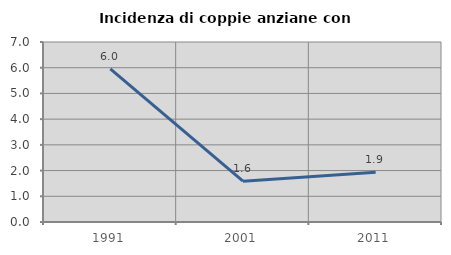
| Category | Incidenza di coppie anziane con figli |
|---|---|
| 1991.0 | 5.952 |
| 2001.0 | 1.587 |
| 2011.0 | 1.932 |